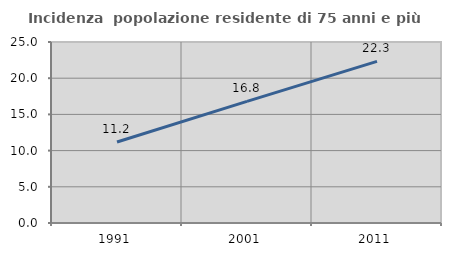
| Category | Incidenza  popolazione residente di 75 anni e più |
|---|---|
| 1991.0 | 11.194 |
| 2001.0 | 16.794 |
| 2011.0 | 22.321 |